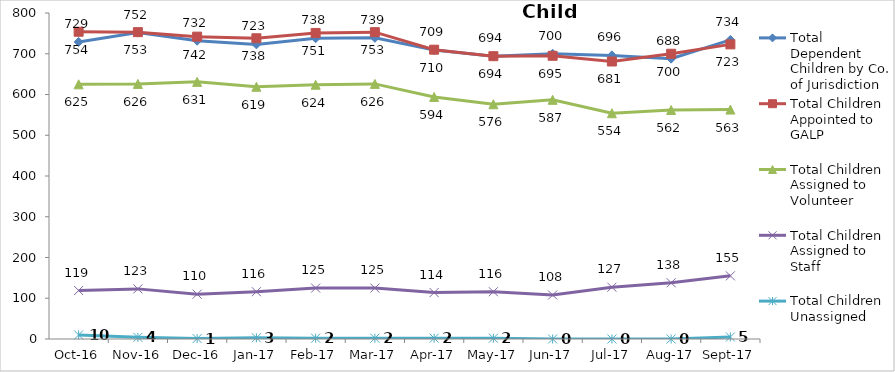
| Category | Total Dependent Children by Co. of Jurisdiction | Total Children Appointed to GALP | Total Children Assigned to Volunteer | Total Children Assigned to Staff | Total Children Unassigned |
|---|---|---|---|---|---|
| 2016-10-01 | 729 | 754 | 625 | 119 | 10 |
| 2016-11-01 | 752 | 753 | 626 | 123 | 4 |
| 2016-12-01 | 732 | 742 | 631 | 110 | 1 |
| 2017-01-01 | 723 | 738 | 619 | 116 | 3 |
| 2017-02-01 | 738 | 751 | 624 | 125 | 2 |
| 2017-03-01 | 739 | 753 | 626 | 125 | 2 |
| 2017-04-01 | 709 | 710 | 594 | 114 | 2 |
| 2017-05-01 | 694 | 694 | 576 | 116 | 2 |
| 2017-06-01 | 700 | 695 | 587 | 108 | 0 |
| 2017-07-01 | 696 | 681 | 554 | 127 | 0 |
| 2017-08-01 | 688 | 700 | 562 | 138 | 0 |
| 2017-09-01 | 734 | 723 | 563 | 155 | 5 |